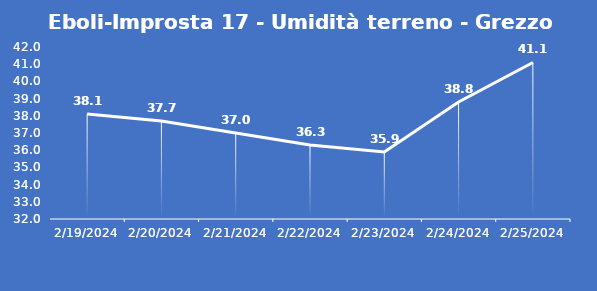
| Category | Eboli-Improsta 17 - Umidità terreno - Grezzo (%VWC) |
|---|---|
| 2/19/24 | 38.1 |
| 2/20/24 | 37.7 |
| 2/21/24 | 37 |
| 2/22/24 | 36.3 |
| 2/23/24 | 35.9 |
| 2/24/24 | 38.8 |
| 2/25/24 | 41.1 |